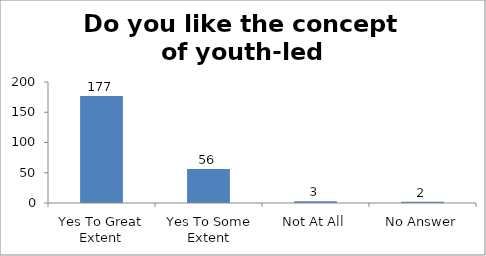
| Category | Do you like the concept of youth-led changemaking?  |
|---|---|
| Yes To Great Extent | 177 |
| Yes To Some Extent | 56 |
| Not At All | 3 |
| No Answer | 2 |